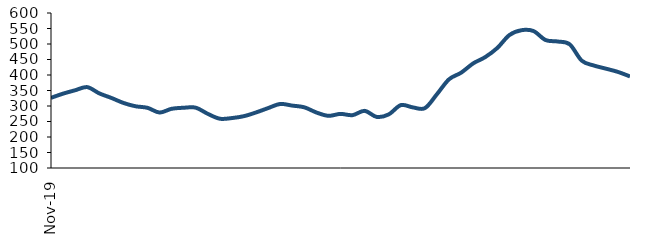
| Category | Series 0 |
|---|---|
| 2019-11-01 | 326.295 |
| 2019-12-01 | 339.824 |
| 2020-01-01 | 350.768 |
| 2020-02-01 | 360.883 |
| 2020-03-01 | 340.754 |
| 2020-04-01 | 326.108 |
| 2020-05-01 | 309.949 |
| 2020-06-01 | 299.181 |
| 2020-07-01 | 294.112 |
| 2020-08-01 | 278.992 |
| 2020-09-01 | 290.987 |
| 2020-10-01 | 294.359 |
| 2020-11-01 | 294.596 |
| 2020-12-01 | 274.651 |
| 2021-01-01 | 258.932 |
| 2021-02-01 | 261.112 |
| 2021-03-01 | 267.235 |
| 2021-04-01 | 279.241 |
| 2021-05-01 | 293.25 |
| 2021-06-01 | 306.524 |
| 2021-07-01 | 301.301 |
| 2021-08-01 | 295.799 |
| 2021-09-01 | 279.082 |
| 2021-10-01 | 268.296 |
| 2021-11-01 | 274.558 |
| 2021-12-01 | 270.511 |
| 2022-01-01 | 284.312 |
| 2022-02-01 | 264.809 |
| 2022-03-01 | 272.939 |
| 2022-04-01 | 302.833 |
| 2022-05-01 | 295.467 |
| 2022-06-01 | 293.185 |
| 2022-07-01 | 338.335 |
| 2022-08-01 | 386.233 |
| 2022-09-01 | 407.447 |
| 2022-10-01 | 437.443 |
| 2022-11-01 | 457.804 |
| 2022-12-01 | 487.211 |
| 2023-01-01 | 528.719 |
| 2023-02-01 | 544.441 |
| 2023-03-01 | 541.779 |
| 2023-04-01 | 512.769 |
| 2023-05-01 | 508.079 |
| 2023-06-01 | 498.924 |
| 2023-07-01 | 446.257 |
| 2023-08-01 | 430.605 |
| 2023-09-01 | 420.483 |
| 2023-10-01 | 409.935 |
| 2023-11-01 | 395.405 |